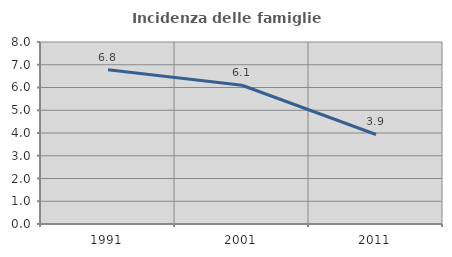
| Category | Incidenza delle famiglie numerose |
|---|---|
| 1991.0 | 6.775 |
| 2001.0 | 6.098 |
| 2011.0 | 3.935 |